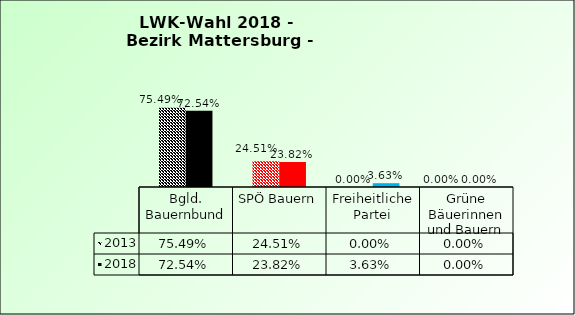
| Category | 2013 | 2018 |
|---|---|---|
| Bgld. Bauernbund | 0.755 | 0.725 |
| SPÖ Bauern | 0.245 | 0.238 |
| Freiheitliche Partei | 0 | 0.036 |
| Grüne Bäuerinnen und Bauern | 0 | 0 |